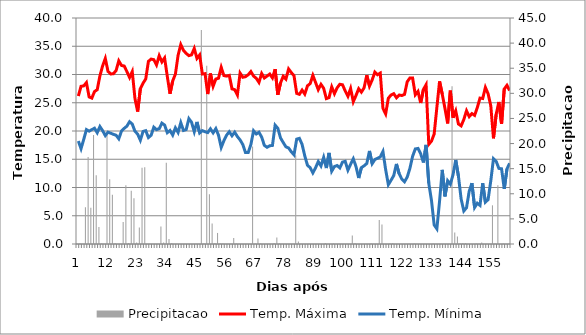
| Category | Precipitacao |
|---|---|
| 0 | 0 |
| 1 | 0.1 |
| 2 | 0 |
| 3 | 7.3 |
| 4 | 17.3 |
| 5 | 7.2 |
| 6 | 21.7 |
| 7 | 13.7 |
| 8 | 3.4 |
| 9 | 0.1 |
| 10 | 0 |
| 11 | 21.7 |
| 12 | 12.9 |
| 13 | 9.8 |
| 14 | 0.2 |
| 15 | 0 |
| 16 | 0 |
| 17 | 4.4 |
| 18 | 11.7 |
| 19 | 0.2 |
| 20 | 10.6 |
| 21 | 9.1 |
| 22 | 0.3 |
| 23 | 3.3 |
| 24 | 15.2 |
| 25 | 15.3 |
| 26 | 0 |
| 27 | 0 |
| 28 | 0 |
| 29 | 0 |
| 30 | 0 |
| 31 | 3.5 |
| 32 | 0.3 |
| 33 | 16.2 |
| 34 | 1 |
| 35 | 0.2 |
| 36 | 0 |
| 37 | 0 |
| 38 | 0 |
| 39 | 0 |
| 40 | 0 |
| 41 | 0 |
| 42 | 0 |
| 43 | 0 |
| 44 | 0 |
| 45 | 0 |
| 46 | 42.6 |
| 47 | 0.1 |
| 48 | 35.5 |
| 49 | 9.9 |
| 50 | 4.1 |
| 51 | 0.2 |
| 52 | 2.2 |
| 53 | 0.1 |
| 54 | 0.1 |
| 55 | 0 |
| 56 | 0 |
| 57 | 0 |
| 58 | 1.2 |
| 59 | 0.1 |
| 60 | 0 |
| 61 | 0 |
| 62 | 0 |
| 63 | 0 |
| 64 | 0 |
| 65 | 19.4 |
| 66 | 0.1 |
| 67 | 1.1 |
| 68 | 0.1 |
| 69 | 0 |
| 70 | 0 |
| 71 | 0 |
| 72 | 0 |
| 73 | 0.2 |
| 74 | 1.3 |
| 75 | 0.1 |
| 76 | 0 |
| 77 | 0 |
| 78 | 0 |
| 79 | 0 |
| 80 | 0 |
| 81 | 17.6 |
| 82 | 0.5 |
| 83 | 0 |
| 84 | 0 |
| 85 | 0 |
| 86 | 0 |
| 87 | 0 |
| 88 | 0 |
| 89 | 0 |
| 90 | 0 |
| 91 | 0 |
| 92 | 0.2 |
| 93 | 0 |
| 94 | 0 |
| 95 | 0.1 |
| 96 | 0 |
| 97 | 0 |
| 98 | 0 |
| 99 | 0 |
| 100 | 0 |
| 101 | 0 |
| 102 | 1.7 |
| 103 | 0.2 |
| 104 | 0 |
| 105 | 0 |
| 106 | 0 |
| 107 | 0 |
| 108 | 0 |
| 109 | 0.1 |
| 110 | 0 |
| 111 | 0 |
| 112 | 4.8 |
| 113 | 3.9 |
| 114 | 0 |
| 115 | 0 |
| 116 | 0.1 |
| 117 | 0.2 |
| 118 | 0 |
| 119 | 0 |
| 120 | 0 |
| 121 | 0 |
| 122 | 0 |
| 123 | 0 |
| 124 | 0 |
| 125 | 0.1 |
| 126 | 0 |
| 127 | 0 |
| 128 | 0 |
| 129 | 0 |
| 130 | 0 |
| 131 | 0 |
| 132 | 0.1 |
| 133 | 0 |
| 134 | 0 |
| 135 | 0 |
| 136 | 0 |
| 137 | 0 |
| 138 | 0 |
| 139 | 31.4 |
| 140 | 2.3 |
| 141 | 1.5 |
| 142 | 0.1 |
| 143 | 0.2 |
| 144 | 0.2 |
| 145 | 0 |
| 146 | 0 |
| 147 | 0 |
| 148 | 0.1 |
| 149 | 0 |
| 150 | 0.3 |
| 151 | 0 |
| 152 | 0 |
| 153 | 0 |
| 154 | 7.7 |
| 155 | 0.1 |
| 156 | 11.7 |
| 157 | 0 |
| 158 | 0.1 |
| 159 | 0 |
| 160 | 0 |